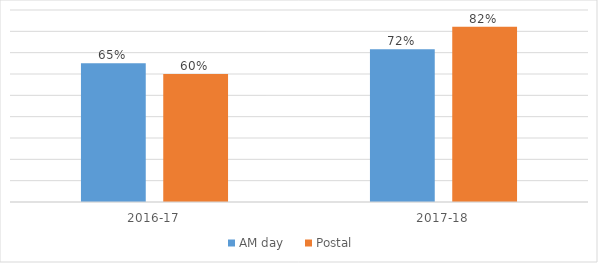
| Category | AM day | Postal |
|---|---|---|
| 2016-17 | 0.65 | 0.6 |
| 2017-18 | 0.716 | 0.821 |